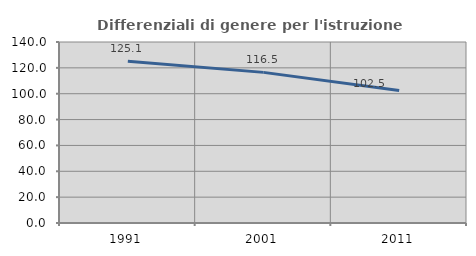
| Category | Differenziali di genere per l'istruzione superiore |
|---|---|
| 1991.0 | 125.055 |
| 2001.0 | 116.507 |
| 2011.0 | 102.549 |